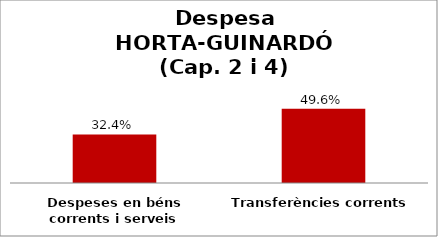
| Category | Series 0 |
|---|---|
| Despeses en béns corrents i serveis | 0.324 |
| Transferències corrents | 0.496 |